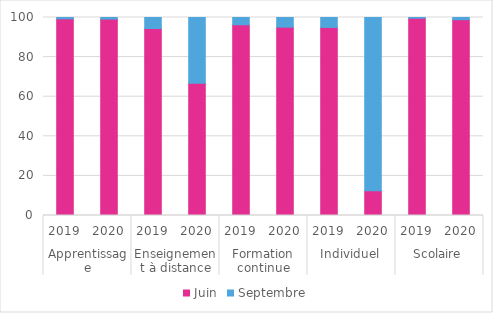
| Category | Juin | Septembre |
|---|---|---|
| 0 | 99.321 | 0.679 |
| 1 | 99.189 | 0.811 |
| 2 | 94.43 | 5.57 |
| 3 | 66.79 | 33.21 |
| 4 | 96.345 | 3.655 |
| 5 | 95.122 | 4.878 |
| 6 | 94.968 | 5.032 |
| 7 | 12.448 | 87.552 |
| 8 | 99.634 | 0.366 |
| 9 | 98.901 | 1.099 |